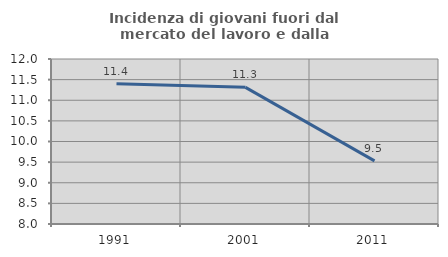
| Category | Incidenza di giovani fuori dal mercato del lavoro e dalla formazione  |
|---|---|
| 1991.0 | 11.398 |
| 2001.0 | 11.312 |
| 2011.0 | 9.529 |